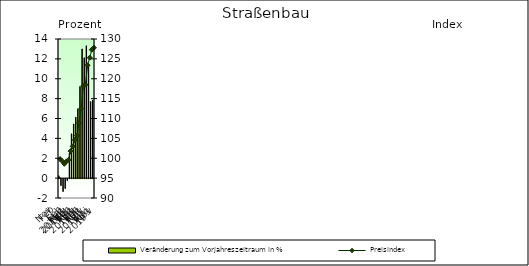
| Category | Veränderung zum Vorjahreszeitraum in % |
|---|---|
| 0 | 0.24 |
| 1 | -0.7 |
| 2 | -1.301 |
| 3 | -0.998 |
| 4 | -0.2 |
| 5 | 2.518 |
| 6 | 4.462 |
| 7 | 5.444 |
| 8 | 6.124 |
| 9 | 6.974 |
| 10 | 9.223 |
| 11 | 13.002 |
| 12 | 12.11 |
| 13 | 13.315 |
| 14 | 11.378 |
| 15 | 7.699 |
| 16 | 7.848 |